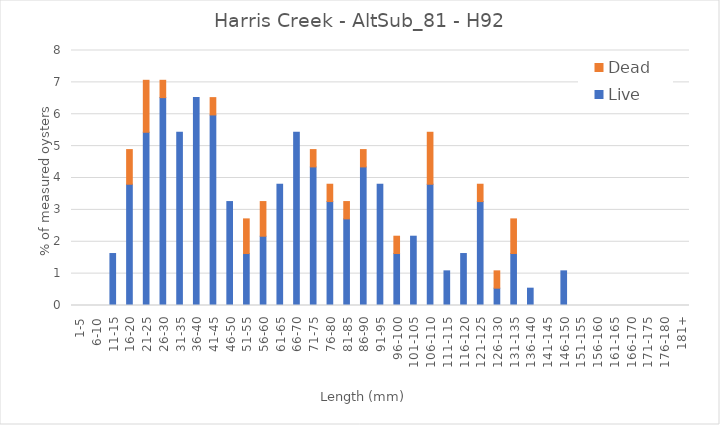
| Category | Live | Dead |
|---|---|---|
| 1-5 | 0 | 0 |
| 6-10 | 0 | 0 |
| 11-15 | 1.63 | 0 |
| 16-20 | 3.804 | 1.087 |
| 21-25 | 5.435 | 1.63 |
| 26-30 | 6.522 | 0.543 |
| 31-35 | 5.435 | 0 |
| 36-40 | 6.522 | 0 |
| 41-45 | 5.978 | 0.543 |
| 46-50 | 3.261 | 0 |
| 51-55 | 1.63 | 1.087 |
| 56-60 | 2.174 | 1.087 |
| 61-65 | 3.804 | 0 |
| 66-70 | 5.435 | 0 |
| 71-75 | 4.348 | 0.543 |
| 76-80 | 3.261 | 0.543 |
| 81-85 | 2.717 | 0.543 |
| 86-90 | 4.348 | 0.543 |
| 91-95 | 3.804 | 0 |
| 96-100 | 1.63 | 0.543 |
| 101-105 | 2.174 | 0 |
| 106-110 | 3.804 | 1.63 |
| 111-115 | 1.087 | 0 |
| 116-120 | 1.63 | 0 |
| 121-125 | 3.261 | 0.543 |
| 126-130 | 0.543 | 0.543 |
| 131-135 | 1.63 | 1.087 |
| 136-140 | 0.543 | 0 |
| 141-145 | 0 | 0 |
| 146-150 | 1.087 | 0 |
| 151-155 | 0 | 0 |
| 156-160 | 0 | 0 |
| 161-165 | 0 | 0 |
| 166-170 | 0 | 0 |
| 171-175 | 0 | 0 |
| 176-180 | 0 | 0 |
| 181+ | 0 | 0 |